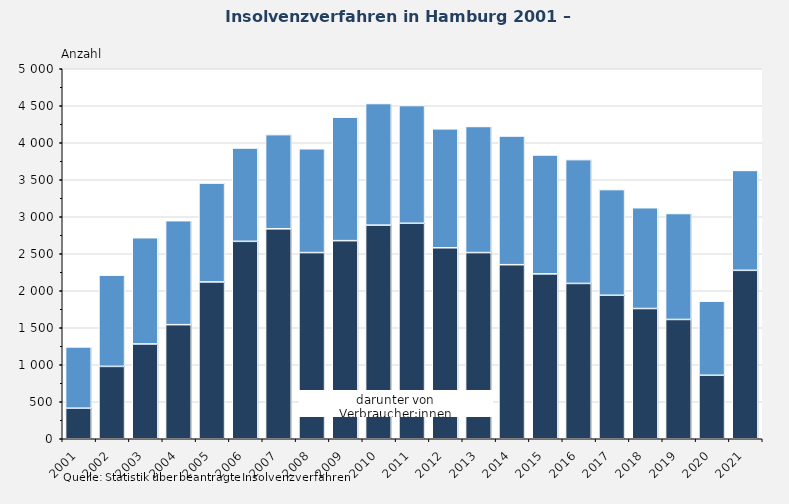
| Category | darunter von Verbraucher:innen | Insgesamt |
|---|---|---|
| 2001.0 | 413 | 828 |
| 2002.0 | 978 | 1233 |
| 2003.0 | 1281 | 1436 |
| 2004.0 | 1542 | 1405 |
| 2005.0 | 2119 | 1336 |
| 2006.0 | 2668 | 1261 |
| 2007.0 | 2837 | 1273 |
| 2008.0 | 2516 | 1403 |
| 2009.0 | 2677 | 1669 |
| 2010.0 | 2887 | 1643 |
| 2011.0 | 2912 | 1591 |
| 2012.0 | 2581 | 1607 |
| 2013.0 | 2516 | 1704 |
| 2014.0 | 2352 | 1739 |
| 2015.0 | 2228 | 1607 |
| 2016.0 | 2099 | 1673 |
| 2017.0 | 1939 | 1428 |
| 2018.0 | 1760 | 1362 |
| 2019.0 | 1612 | 1432 |
| 2020.0 | 858 | 1001 |
| 2021.0 | 2276 | 1350 |